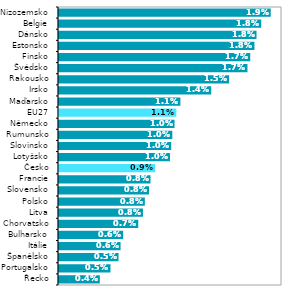
| Category | 2019* |
|---|---|
| Řecko | 0.004 |
| Portugalsko | 0.005 |
| Španělsko | 0.005 |
| Itálie | 0.006 |
| Bulharsko | 0.006 |
| Chorvatsko | 0.007 |
| Litva | 0.008 |
| Polsko | 0.008 |
| Slovensko | 0.008 |
| Francie | 0.008 |
| Česko | 0.009 |
| Lotyšsko | 0.01 |
| Slovinsko | 0.01 |
| Rumunsko | 0.01 |
| Německo | 0.01 |
| EU27 | 0.011 |
| Maďarsko | 0.011 |
| Irsko | 0.014 |
| Rakousko | 0.015 |
| Švédsko | 0.017 |
| Finsko | 0.017 |
| Estonsko | 0.018 |
| Dánsko | 0.018 |
| Belgie | 0.018 |
| Nizozemsko | 0.019 |